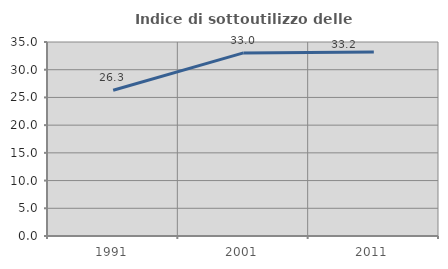
| Category | Indice di sottoutilizzo delle abitazioni  |
|---|---|
| 1991.0 | 26.298 |
| 2001.0 | 33.028 |
| 2011.0 | 33.214 |